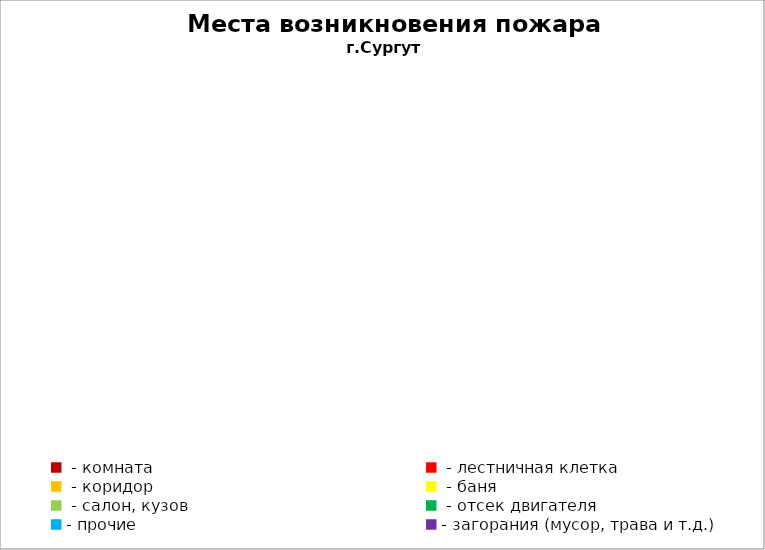
| Category | Места возникновения пожара |
|---|---|
|  - комната | 36 |
|  - лестничная клетка | 15 |
|  - коридор | 2 |
|  - баня | 17 |
|  - салон, кузов | 15 |
|  - отсек двигателя | 21 |
| - прочие | 50 |
| - загорания (мусор, трава и т.д.)  | 109 |